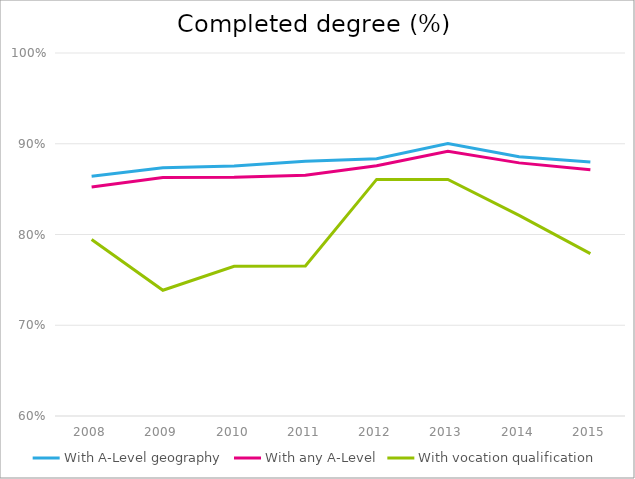
| Category | With A-Level geography | With any A-Level | With vocation qualification |
|---|---|---|---|
| 2008.0 | 0.864 | 0.852 | 0.794 |
| 2009.0 | 0.874 | 0.863 | 0.739 |
| 2010.0 | 0.876 | 0.863 | 0.765 |
| 2011.0 | 0.881 | 0.865 | 0.765 |
| 2012.0 | 0.884 | 0.876 | 0.861 |
| 2013.0 | 0.9 | 0.892 | 0.861 |
| 2014.0 | 0.886 | 0.879 | 0.821 |
| 2015.0 | 0.88 | 0.871 | 0.779 |